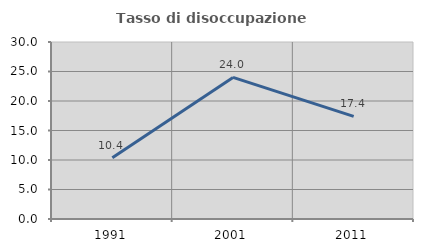
| Category | Tasso di disoccupazione giovanile  |
|---|---|
| 1991.0 | 10.39 |
| 2001.0 | 24 |
| 2011.0 | 17.391 |